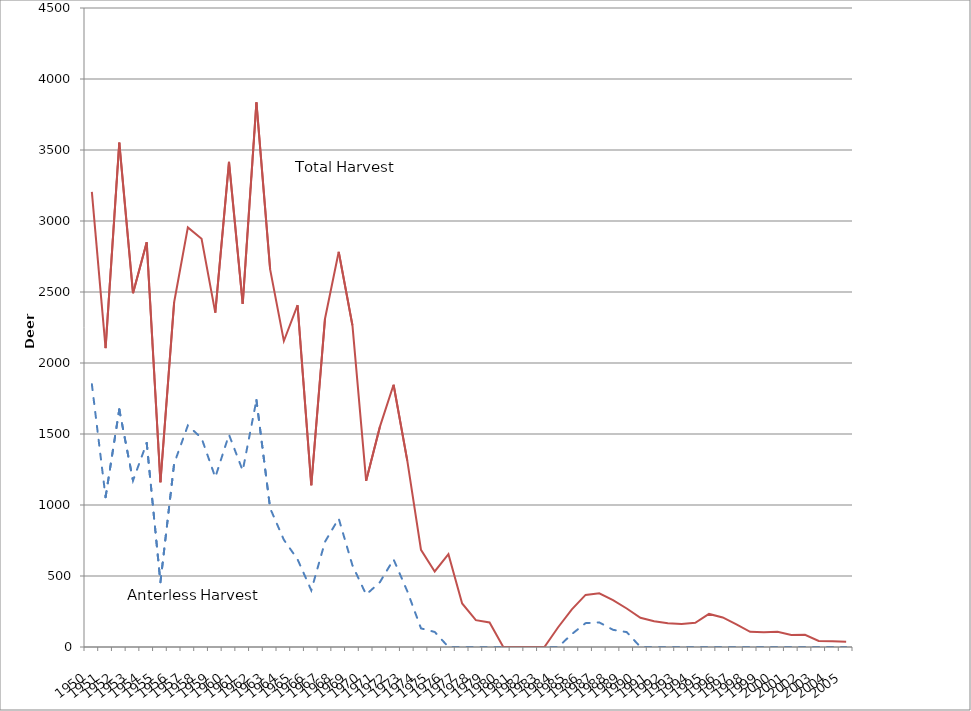
| Category | Series 0 | Series 1 |
|---|---|---|
| 1950.0 | 1851 | 3205 |
| 1951.0 | 1055 | 2105 |
| 1952.0 | 1673 | 3552 |
| 1953.0 | 1172 | 2492 |
| 1954.0 | 1437 | 2850 |
| 1955.0 | 456 | 1160 |
| 1956.0 | 1292 | 2428 |
| 1957.0 | 1560 | 2955 |
| 1958.0 | 1471 | 2875 |
| 1959.0 | 1195 | 2355 |
| 1960.0 | 1495 | 3416 |
| 1961.0 | 1242 | 2417 |
| 1962.0 | 1739 | 3835 |
| 1963.0 | 977 | 2659 |
| 1964.0 | 755 | 2155 |
| 1965.0 | 617 | 2407 |
| 1966.0 | 399 | 1139 |
| 1967.0 | 741 | 2312 |
| 1968.0 | 905 | 2783 |
| 1969.0 | 575 | 2266 |
| 1970.0 | 369 | 1170 |
| 1971.0 | 456 | 1550 |
| 1972.0 | 617 | 1847 |
| 1973.0 | 393 | 1313 |
| 1974.0 | 131 | 684 |
| 1975.0 | 106 | 532 |
| 1976.0 | 0 | 654 |
| 1977.0 | 0 | 307 |
| 1978.0 | 0 | 189 |
| 1979.0 | 0 | 173 |
| 1980.0 | 0 | 0 |
| 1981.0 | 0 | 0 |
| 1982.0 | 0 | 0 |
| 1983.0 | 0 | 0 |
| 1984.0 | 0 | 139 |
| 1985.0 | 91 | 265 |
| 1986.0 | 168 | 367 |
| 1987.0 | 173 | 378 |
| 1988.0 | 121 | 330 |
| 1989.0 | 105 | 271 |
| 1990.0 | 0 | 206 |
| 1991.0 | 0 | 182 |
| 1992.0 | 0 | 168 |
| 1993.0 | 0 | 162 |
| 1994.0 | 0 | 170 |
| 1995.0 | 0 | 233 |
| 1996.0 | 0 | 208 |
| 1997.0 | 0 | 159 |
| 1998.0 | 0 | 107 |
| 1999.0 | 0 | 103 |
| 2000.0 | 0 | 107 |
| 2001.0 | 0 | 85 |
| 2002.0 | 0 | 86 |
| 2003.0 | 0 | 43 |
| 2004.0 | 0 | 41 |
| 2005.0 | 0 | 37 |